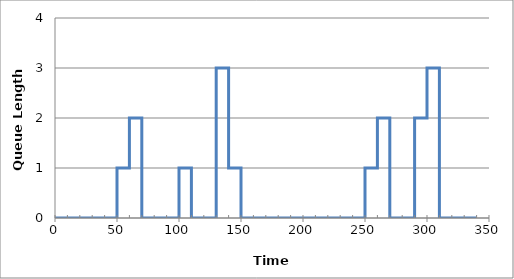
| Category | Series 0 |
|---|---|
| 0.0 | 0 |
| 50.0 | 0 |
| 50.0 | 1 |
| 60.0 | 1 |
| 60.0 | 2 |
| 70.0 | 2 |
| 70.0 | 0 |
| 100.0 | 0 |
| 100.0 | 1 |
| 110.0 | 1 |
| 110.0 | 0 |
| 130.0 | 0 |
| 130.0 | 3 |
| 140.0 | 3 |
| 140.0 | 1 |
| 150.0 | 1 |
| 150.0 | 0 |
| 250.0 | 0 |
| 250.0 | 1 |
| 260.0 | 1 |
| 260.0 | 2 |
| 270.0 | 2 |
| 270.0 | 0 |
| 290.0 | 0 |
| 290.0 | 2 |
| 300.0 | 2 |
| 300.0 | 3 |
| 310.0 | 3 |
| 310.0 | 0 |
| 340.0 | 0 |